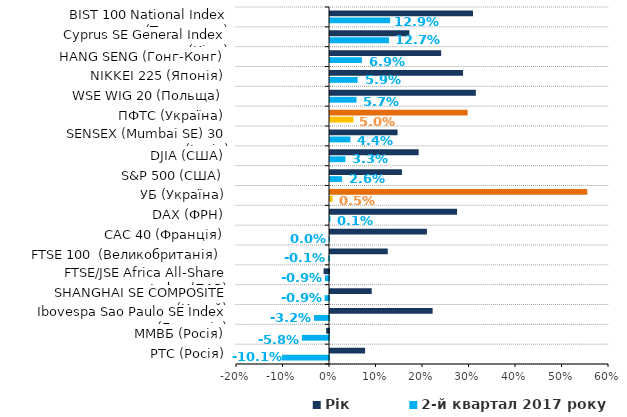
| Category | 2-й квартал 2017 року | Рік |
|---|---|---|
| РТС (Росія) | -0.101 | 0.075 |
| ММВБ (Росія) | -0.058 | -0.006 |
| Ibovespa Sao Paulo SE Index (Бразилія) | -0.032 | 0.221 |
| SHANGHAI SE COMPOSITE (Китай) | -0.009 | 0.09 |
| FTSE/JSE Africa All-Share Index (ПАР) | -0.009 | -0.012 |
| FTSE 100  (Великобританія) | -0.001 | 0.124 |
| CAC 40 (Франція) | 0 | 0.208 |
| DAX (ФРН) | 0.001 | 0.273 |
| УБ (Україна) | 0.005 | 0.553 |
| S&P 500 (США) | 0.026 | 0.155 |
| DJIA (США) | 0.033 | 0.191 |
| SENSEX (Mumbai SE) 30 (Індія) | 0.044 | 0.145 |
| ПФТС (Україна) | 0.05 | 0.296 |
| WSE WIG 20 (Польща) | 0.057 | 0.314 |
| NIKKEI 225 (Японія) | 0.059 | 0.286 |
| HANG SENG (Гонг-Конг) | 0.069 | 0.239 |
| Cyprus SE General Index (Кіпр) | 0.127 | 0.171 |
| BIST 100 National Index (Туреччина) | 0.129 | 0.308 |